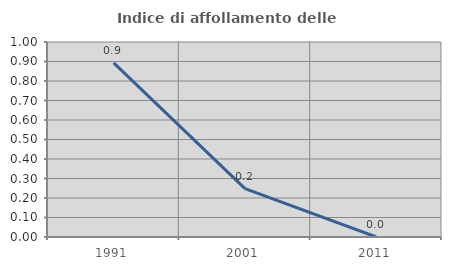
| Category | Indice di affollamento delle abitazioni  |
|---|---|
| 1991.0 | 0.893 |
| 2001.0 | 0.248 |
| 2011.0 | 0 |